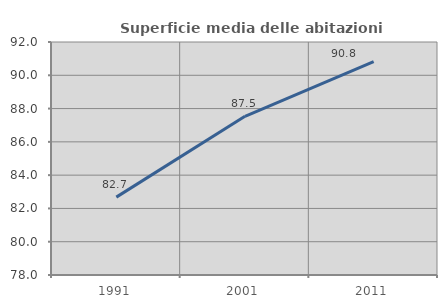
| Category | Superficie media delle abitazioni occupate |
|---|---|
| 1991.0 | 82.679 |
| 2001.0 | 87.534 |
| 2011.0 | 90.826 |